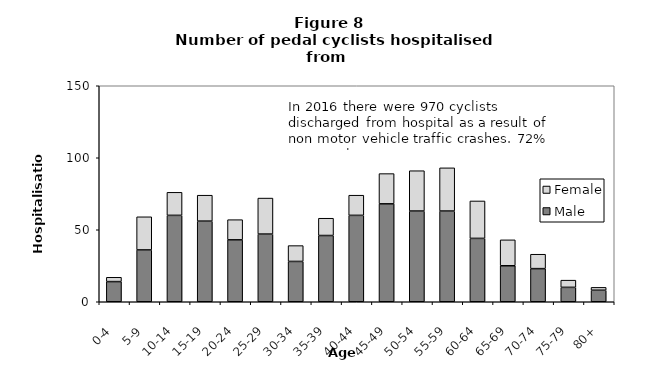
| Category | Male | Female |
|---|---|---|
| 0-4 | 14 | 3 |
| 5-9 | 36 | 23 |
| 10-14 | 60 | 16 |
| 15-19 | 56 | 18 |
| 20-24 | 43 | 14 |
| 25-29 | 47 | 25 |
| 30-34 | 28 | 11 |
| 35-39 | 46 | 12 |
| 40-44 | 60 | 14 |
| 45-49 | 68 | 21 |
| 50-54 | 63 | 28 |
| 55-59 | 63 | 30 |
| 60-64 | 44 | 26 |
| 65-69 | 25 | 18 |
| 70-74 | 23 | 10 |
| 75-79 | 10 | 5 |
| 80+ | 8 | 2 |